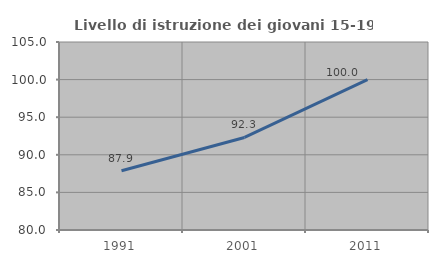
| Category | Livello di istruzione dei giovani 15-19 anni |
|---|---|
| 1991.0 | 87.879 |
| 2001.0 | 92.308 |
| 2011.0 | 100 |